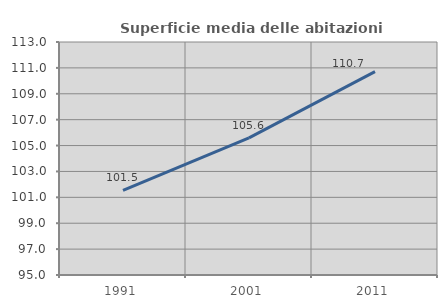
| Category | Superficie media delle abitazioni occupate |
|---|---|
| 1991.0 | 101.538 |
| 2001.0 | 105.598 |
| 2011.0 | 110.71 |